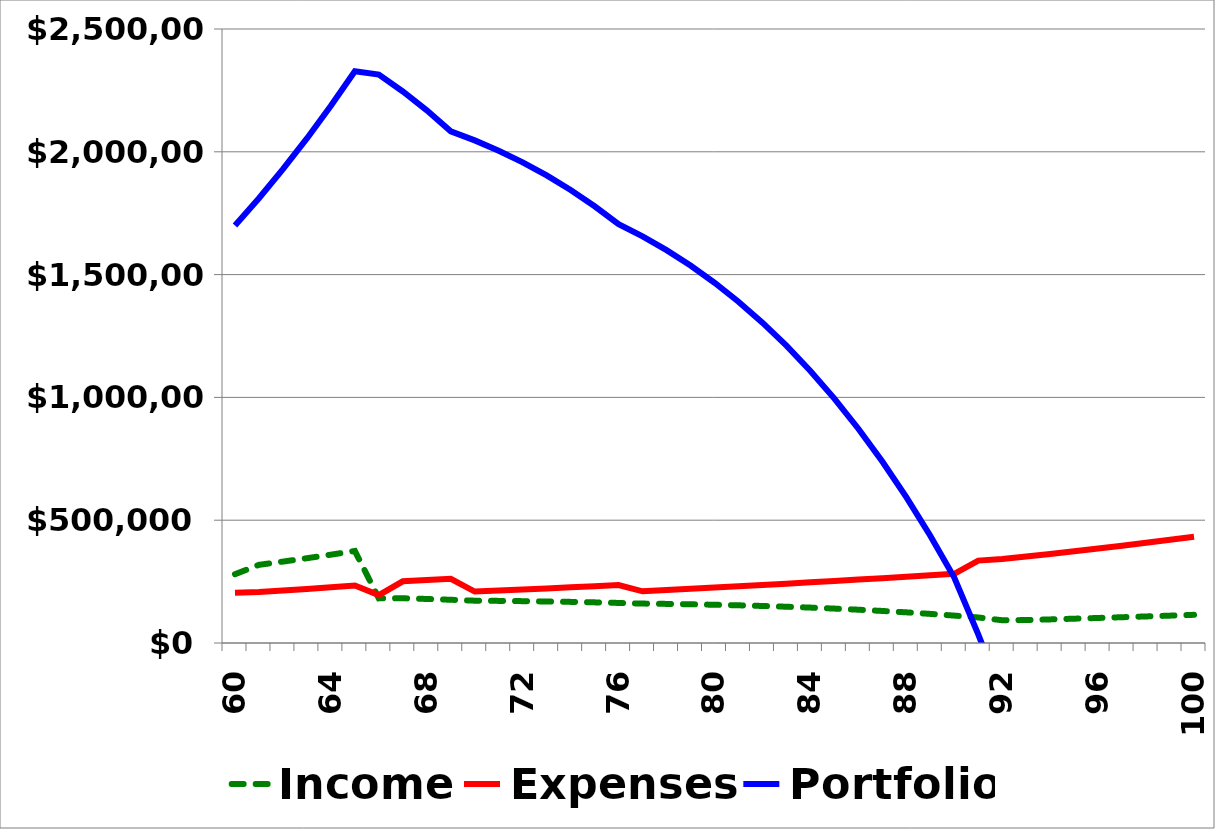
| Category | Income | Expenses | Portfolio |
|---|---|---|---|
| 60.0 | 280000 | 205000 | 1700000 |
| 61.0 | 318300 | 207176 | 1811124 |
| 62.0 | 331456.44 | 213464.917 | 1929115.523 |
| 63.0 | 345219.601 | 219989.147 | 2054345.977 |
| 64.0 | 359617.609 | 226757.934 | 2187205.652 |
| 65.0 | 374679.895 | 233780.899 | 2328104.648 |
| 66.0 | 181686.279 | 195142.843 | 2314648.084 |
| 67.0 | 182138.885 | 251171.014 | 2245615.955 |
| 68.0 | 179294.757 | 256158.32 | 2168752.392 |
| 69.0 | 176019.678 | 261219.207 | 2083552.863 |
| 70.0 | 172284.542 | 209347.669 | 2046489.735 |
| 71.0 | 171478.895 | 213593.779 | 2004374.851 |
| 72.0 | 170412.688 | 217915.266 | 1956872.273 |
| 73.0 | 169067.039 | 222311.958 | 1903627.354 |
| 74.0 | 167421.985 | 226783.562 | 1844265.776 |
| 75.0 | 165456.42 | 231329.66 | 1778392.537 |
| 76.0 | 163148.04 | 235949.694 | 1705590.883 |
| 77.0 | 160473.276 | 210365.712 | 1655698.447 |
| 78.0 | 159223.864 | 215342.689 | 1599579.622 |
| 79.0 | 157653.193 | 220406.545 | 1536826.271 |
| 80.0 | 155738.345 | 225556.963 | 1467007.652 |
| 81.0 | 153455.091 | 230793.483 | 1389669.26 |
| 82.0 | 150777.826 | 236115.486 | 1304331.6 |
| 83.0 | 147679.497 | 241522.184 | 1210488.913 |
| 84.0 | 144131.523 | 247012.611 | 1107607.825 |
| 85.0 | 140103.724 | 252585.605 | 995125.944 |
| 86.0 | 135564.228 | 258239.8 | 872450.372 |
| 87.0 | 130479.394 | 263973.606 | 738956.16 |
| 88.0 | 124813.713 | 269785.201 | 593984.672 |
| 89.0 | 118529.714 | 275672.506 | 436841.88 |
| 90.0 | 111587.865 | 281633.179 | 266796.566 |
| 91.0 | 103946.467 | 335376.659 | 35366.374 |
| 92.0 | 92698.816 | 342277.429 | -214212.239 |
| 93.0 | 93294.138 | 352064.91 | -472983.011 |
| 94.0 | 96092.962 | 362626.858 | -739516.907 |
| 95.0 | 98975.751 | 373505.663 | -1014046.819 |
| 96.0 | 101945.024 | 384710.833 | -1296812.628 |
| 97.0 | 105003.375 | 396252.158 | -1588061.412 |
| 98.0 | 108153.476 | 408139.723 | -1888047.66 |
| 99.0 | 111398.08 | 420383.915 | -2197033.494 |
| 100.0 | 114740.022 | 432995.432 | -2515288.904 |